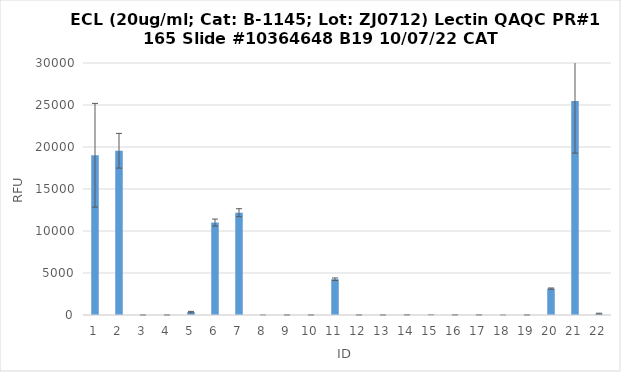
| Category | RFU |
|---|---|
| 0 | 19015 |
| 1 | 19551.75 |
| 2 | 1.25 |
| 3 | 1.25 |
| 4 | 342.5 |
| 5 | 11003 |
| 6 | 12177 |
| 7 | 3.5 |
| 8 | 3.75 |
| 9 | 3.5 |
| 10 | 4258.25 |
| 11 | -1.25 |
| 12 | 0.75 |
| 13 | 18 |
| 14 | 11.25 |
| 15 | 13.5 |
| 16 | 9.5 |
| 17 | 1 |
| 18 | 3.75 |
| 19 | 3144 |
| 20 | 25464.25 |
| 21 | 148.25 |